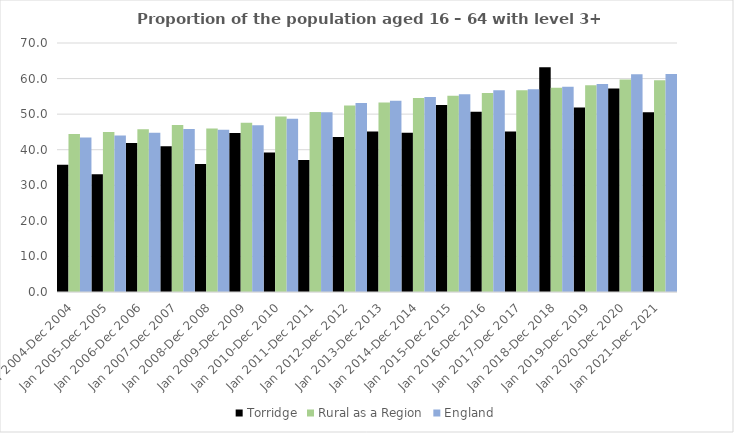
| Category | Torridge | Rural as a Region | England |
|---|---|---|---|
| Jan 2004-Dec 2004 | 35.8 | 44.405 | 43.4 |
| Jan 2005-Dec 2005 | 33.1 | 44.973 | 44 |
| Jan 2006-Dec 2006 | 41.9 | 45.774 | 44.8 |
| Jan 2007-Dec 2007 | 41 | 46.968 | 45.8 |
| Jan 2008-Dec 2008 | 36 | 45.964 | 45.6 |
| Jan 2009-Dec 2009 | 44.7 | 47.59 | 46.9 |
| Jan 2010-Dec 2010 | 39.2 | 49.362 | 48.7 |
| Jan 2011-Dec 2011 | 37.1 | 50.602 | 50.5 |
| Jan 2012-Dec 2012 | 43.6 | 52.439 | 53.1 |
| Jan 2013-Dec 2013 | 45.1 | 53.276 | 53.8 |
| Jan 2014-Dec 2014 | 44.8 | 54.57 | 54.8 |
| Jan 2015-Dec 2015 | 52.6 | 55.16 | 55.6 |
| Jan 2016-Dec 2016 | 50.7 | 55.941 | 56.7 |
| Jan 2017-Dec 2017 | 45.1 | 56.689 | 57 |
| Jan 2018-Dec 2018 | 63.2 | 57.389 | 57.7 |
| Jan 2019-Dec 2019 | 51.9 | 58.147 | 58.5 |
| Jan 2020-Dec 2020 | 57.2 | 59.771 | 61.2 |
| Jan 2021-Dec 2021 | 50.5 | 59.54 | 61.3 |